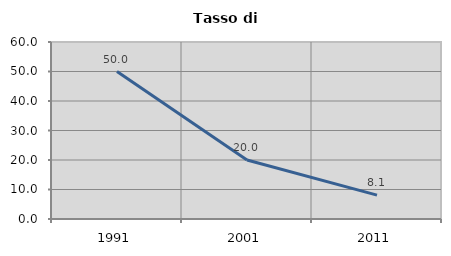
| Category | Tasso di disoccupazione   |
|---|---|
| 1991.0 | 50 |
| 2001.0 | 20 |
| 2011.0 | 8.108 |